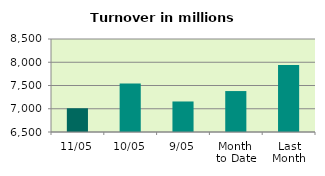
| Category | Series 0 |
|---|---|
| 11/05 | 7010.287 |
| 10/05 | 7541.302 |
| 9/05 | 7156.422 |
| Month 
to Date | 7380.527 |
| Last
Month | 7939.051 |